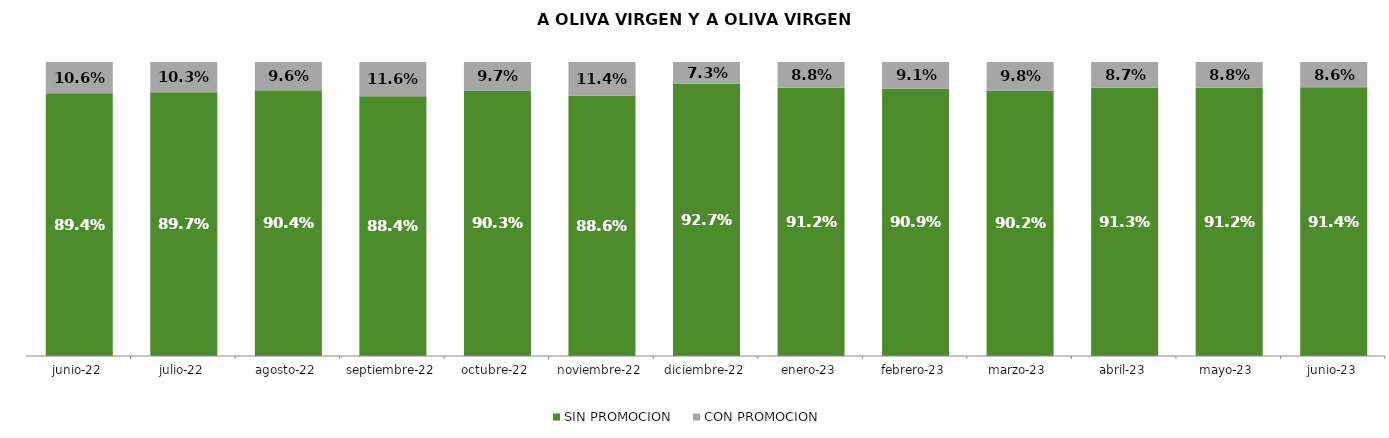
| Category | SIN PROMOCION   | CON PROMOCION   |
|---|---|---|
| 2022-06-01 | 0.894 | 0.106 |
| 2022-07-01 | 0.897 | 0.103 |
| 2022-08-01 | 0.904 | 0.096 |
| 2022-09-01 | 0.884 | 0.116 |
| 2022-10-01 | 0.903 | 0.097 |
| 2022-11-01 | 0.886 | 0.114 |
| 2022-12-01 | 0.927 | 0.073 |
| 2023-01-01 | 0.912 | 0.088 |
| 2023-02-01 | 0.909 | 0.091 |
| 2023-03-01 | 0.902 | 0.098 |
| 2023-04-01 | 0.913 | 0.087 |
| 2023-05-01 | 0.912 | 0.088 |
| 2023-06-01 | 0.914 | 0.086 |